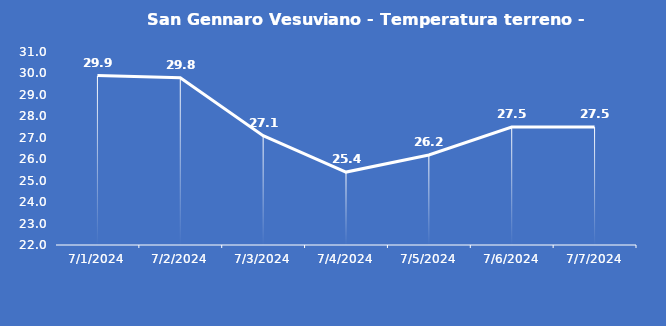
| Category | San Gennaro Vesuviano - Temperatura terreno - Grezzo (°C) |
|---|---|
| 7/1/24 | 29.9 |
| 7/2/24 | 29.8 |
| 7/3/24 | 27.1 |
| 7/4/24 | 25.4 |
| 7/5/24 | 26.2 |
| 7/6/24 | 27.5 |
| 7/7/24 | 27.5 |